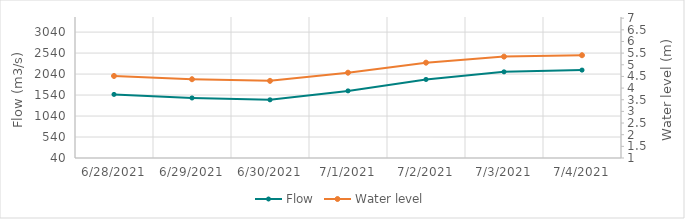
| Category | Flow |
|---|---|
| 6/6/21 | 3111.95 |
| 6/5/21 | 3178.63 |
| 6/4/21 | 3232.52 |
| 6/3/21 | 3221.12 |
| 6/2/21 | 3142.4 |
| 6/1/21 | 2993.93 |
| 5/31/21 | 2860.66 |